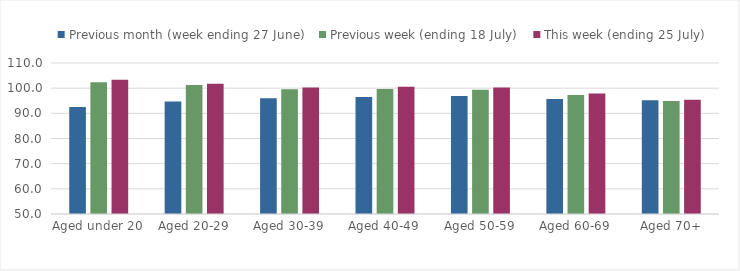
| Category | Previous month (week ending 27 June) | Previous week (ending 18 July) | This week (ending 25 July) |
|---|---|---|---|
| Aged under 20 | 92.468 | 102.324 | 103.389 |
| Aged 20-29 | 94.747 | 101.304 | 101.742 |
| Aged 30-39 | 96.018 | 99.591 | 100.292 |
| Aged 40-49 | 96.464 | 99.709 | 100.577 |
| Aged 50-59 | 96.855 | 99.406 | 100.239 |
| Aged 60-69 | 95.704 | 97.272 | 97.905 |
| Aged 70+ | 95.191 | 94.908 | 95.364 |